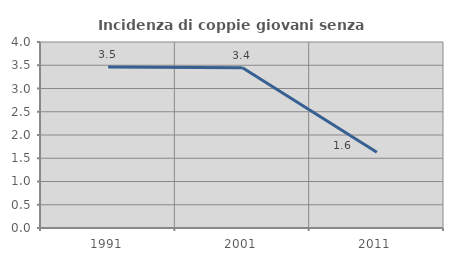
| Category | Incidenza di coppie giovani senza figli |
|---|---|
| 1991.0 | 3.461 |
| 2001.0 | 3.448 |
| 2011.0 | 1.63 |